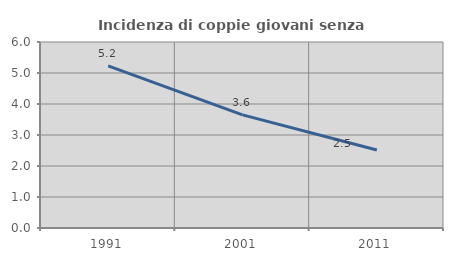
| Category | Incidenza di coppie giovani senza figli |
|---|---|
| 1991.0 | 5.232 |
| 2001.0 | 3.648 |
| 2011.0 | 2.514 |